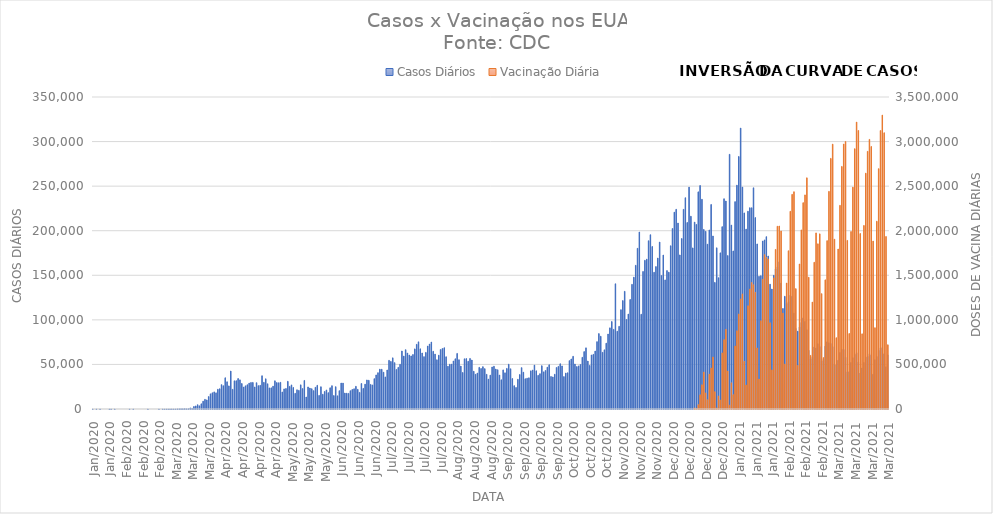
| Category | Casos Diários |
|---|---|
| Jan/2020 | 1 |
| Jan/2020 | 0 |
| Jan/2020 | 1 |
| Jan/2020 | 0 |
| Jan/2020 | 3 |
| Jan/2020 | 0 |
| Jan/2020 | 0 |
| Jan/2020 | 0 |
| Jan/2020 | 0 |
| Jan/2020 | 2 |
| Feb/2020 | 1 |
| Feb/2020 | 0 |
| Feb/2020 | 3 |
| Feb/2020 | 0 |
| Feb/2020 | 0 |
| Feb/2020 | 0 |
| Feb/2020 | 0 |
| Feb/2020 | 0 |
| Feb/2020 | 0 |
| Feb/2020 | 0 |
| Feb/2020 | 1 |
| Feb/2020 | 0 |
| Feb/2020 | 1 |
| Feb/2020 | 0 |
| Feb/2020 | 0 |
| Feb/2020 | 0 |
| Feb/2020 | 0 |
| Feb/2020 | 0 |
| Feb/2020 | 0 |
| Feb/2020 | 0 |
| Feb/2020 | 2 |
| Feb/2020 | 0 |
| Feb/2020 | 0 |
| Feb/2020 | 0 |
| Feb/2020 | 0 |
| Feb/2020 | 0 |
| Feb/2020 | 1 |
| Feb/2020 | 0 |
| Feb/2020 | 10 |
| Mar/2020 | 6 |
| Mar/2020 | 25 |
| Mar/2020 | 24 |
| Mar/2020 | 22 |
| Mar/2020 | 63 |
| Mar/2020 | 52 |
| Mar/2020 | 64 |
| Mar/2020 | 150 |
| Mar/2020 | 218 |
| Mar/2020 | 303 |
| Mar/2020 | 289 |
| Mar/2020 | 431 |
| Mar/2020 | 302 |
| Mar/2020 | 373 |
| Mar/2020 | 1203 |
| Mar/2020 | 770 |
| Mar/2020 | 2802 |
| Mar/2020 | 3425 |
| Mar/2020 | 4788 |
| Mar/2020 | 3558 |
| Mar/2020 | 5834 |
| Mar/2020 | 8831 |
| Mar/2020 | 10842 |
| Mar/2020 | 10190 |
| Mar/2020 | 13943 |
| Mar/2020 | 16972 |
| Mar/2020 | 18161 |
| Mar/2020 | 19208 |
| Mar/2020 | 18132 |
| Mar/2020 | 22132 |
| Mar/2020 | 22728 |
| Apr/2020 | 27325 |
| Apr/2020 | 26081 |
| Apr/2020 | 35038 |
| Apr/2020 | 30561 |
| Apr/2020 | 25941 |
| Apr/2020 | 42568 |
| Apr/2020 | 22060 |
| Apr/2020 | 31610 |
| Apr/2020 | 31720 |
| Apr/2020 | 34184 |
| Apr/2020 | 32682 |
| Apr/2020 | 28584 |
| Apr/2020 | 24674 |
| Apr/2020 | 25971 |
| Apr/2020 | 27207 |
| Apr/2020 | 29056 |
| Apr/2020 | 29776 |
| Apr/2020 | 29847 |
| Apr/2020 | 24696 |
| Apr/2020 | 29489 |
| Apr/2020 | 26211 |
| Apr/2020 | 26564 |
| Apr/2020 | 37308 |
| Apr/2020 | 29929 |
| Apr/2020 | 33869 |
| Apr/2020 | 28276 |
| Apr/2020 | 23680 |
| Apr/2020 | 23731 |
| Apr/2020 | 25655 |
| Apr/2020 | 31643 |
| May/2020 | 29637 |
| May/2020 | 29447 |
| May/2020 | 29955 |
| May/2020 | 19094 |
| May/2020 | 22536 |
| May/2020 | 23051 |
| May/2020 | 31058 |
| May/2020 | 25349 |
| May/2020 | 27026 |
| May/2020 | 24148 |
| May/2020 | 17595 |
| May/2020 | 21564 |
| May/2020 | 20894 |
| May/2020 | 27071 |
| May/2020 | 22894 |
| May/2020 | 32030 |
| May/2020 | 13451 |
| May/2020 | 24746 |
| May/2020 | 23546 |
| May/2020 | 22739 |
| May/2020 | 20592 |
| May/2020 | 24330 |
| May/2020 | 26547 |
| May/2020 | 15277 |
| May/2020 | 24975 |
| May/2020 | 16545 |
| May/2020 | 19713 |
| May/2020 | 21364 |
| May/2020 | 18306 |
| May/2020 | 23797 |
| May/2020 | 26146 |
| Jun/2020 | 15067 |
| Jun/2020 | 25000 |
| Jun/2020 | 14795 |
| Jun/2020 | 20549 |
| Jun/2020 | 29130 |
| Jun/2020 | 29067 |
| Jun/2020 | 17929 |
| Jun/2020 | 17711 |
| Jun/2020 | 17516 |
| Jun/2020 | 20512 |
| Jun/2020 | 21875 |
| Jun/2020 | 22693 |
| Jun/2020 | 25466 |
| Jun/2020 | 22052 |
| Jun/2020 | 18643 |
| Jun/2020 | 28581 |
| Jun/2020 | 23136 |
| Jun/2020 | 27872 |
| Jun/2020 | 32573 |
| Jun/2020 | 32250 |
| Jun/2020 | 27563 |
| Jun/2020 | 26992 |
| Jun/2020 | 34030 |
| Jun/2020 | 38200 |
| Jun/2020 | 40745 |
| Jun/2020 | 44670 |
| Jun/2020 | 44604 |
| Jun/2020 | 41267 |
| Jun/2020 | 35960 |
| Jun/2020 | 43756 |
| Jul/2020 | 54610 |
| Jul/2020 | 53393 |
| Jul/2020 | 57373 |
| Jul/2020 | 51984 |
| Jul/2020 | 44359 |
| Jul/2020 | 46716 |
| Jul/2020 | 50188 |
| Jul/2020 | 65068 |
| Jul/2020 | 59336 |
| Jul/2020 | 66527 |
| Jul/2020 | 62771 |
| Jul/2020 | 60548 |
| Jul/2020 | 59521 |
| Jul/2020 | 61154 |
| Jul/2020 | 67435 |
| Jul/2020 | 72533 |
| Jul/2020 | 75319 |
| Jul/2020 | 67495 |
| Jul/2020 | 62833 |
| Jul/2020 | 58728 |
| Jul/2020 | 63509 |
| Jul/2020 | 70635 |
| Jul/2020 | 72841 |
| Jul/2020 | 75100 |
| Jul/2020 | 64750 |
| Jul/2020 | 61596 |
| Jul/2020 | 55213 |
| Jul/2020 | 60338 |
| Jul/2020 | 66761 |
| Jul/2020 | 67842 |
| Jul/2020 | 68718 |
| Aug/2020 | 58627 |
| Aug/2020 | 48024 |
| Aug/2020 | 50166 |
| Aug/2020 | 50351 |
| Aug/2020 | 53863 |
| Aug/2020 | 56321 |
| Aug/2020 | 62358 |
| Aug/2020 | 55272 |
| Aug/2020 | 48135 |
| Aug/2020 | 40952 |
| Aug/2020 | 56321 |
| Aug/2020 | 56546 |
| Aug/2020 | 53596 |
| Aug/2020 | 56705 |
| Aug/2020 | 54945 |
| Aug/2020 | 42360 |
| Aug/2020 | 38978 |
| Aug/2020 | 40316 |
| Aug/2020 | 46730 |
| Aug/2020 | 45447 |
| Aug/2020 | 47479 |
| Aug/2020 | 45263 |
| Aug/2020 | 38896 |
| Aug/2020 | 33517 |
| Aug/2020 | 37971 |
| Aug/2020 | 47150 |
| Aug/2020 | 47976 |
| Aug/2020 | 44818 |
| Aug/2020 | 43996 |
| Aug/2020 | 38089 |
| Aug/2020 | 32750 |
| Sep/2020 | 43869 |
| Sep/2020 | 40584 |
| Sep/2020 | 45529 |
| Sep/2020 | 50266 |
| Sep/2020 | 45108 |
| Sep/2020 | 34162 |
| Sep/2020 | 26171 |
| Sep/2020 | 24174 |
| Sep/2020 | 33322 |
| Sep/2020 | 38615 |
| Sep/2020 | 46414 |
| Sep/2020 | 41309 |
| Sep/2020 | 33918 |
| Sep/2020 | 34516 |
| Sep/2020 | 35009 |
| Sep/2020 | 42785 |
| Sep/2020 | 43711 |
| Sep/2020 | 49238 |
| Sep/2020 | 42856 |
| Sep/2020 | 37738 |
| Sep/2020 | 39601 |
| Sep/2020 | 48562 |
| Sep/2020 | 41648 |
| Sep/2020 | 43241 |
| Sep/2020 | 46882 |
| Sep/2020 | 49636 |
| Sep/2020 | 36486 |
| Sep/2020 | 35947 |
| Sep/2020 | 38997 |
| Sep/2020 | 46567 |
| Oct/2020 | 47788 |
| Oct/2020 | 50742 |
| Oct/2020 | 48309 |
| Oct/2020 | 36335 |
| Oct/2020 | 40262 |
| Oct/2020 | 40665 |
| Oct/2020 | 54243 |
| Oct/2020 | 56121 |
| Oct/2020 | 59115 |
| Oct/2020 | 50434 |
| Oct/2020 | 47542 |
| Oct/2020 | 48359 |
| Oct/2020 | 49921 |
| Oct/2020 | 57989 |
| Oct/2020 | 64380 |
| Oct/2020 | 68597 |
| Oct/2020 | 53810 |
| Oct/2020 | 48887 |
| Oct/2020 | 60606 |
| Oct/2020 | 61308 |
| Oct/2020 | 64999 |
| Oct/2020 | 75551 |
| Oct/2020 | 84581 |
| Oct/2020 | 81598 |
| Oct/2020 | 63579 |
| Oct/2020 | 66364 |
| Oct/2020 | 73858 |
| Oct/2020 | 84123 |
| Oct/2020 | 91019 |
| Oct/2020 | 98074 |
| Oct/2020 | 89321 |
| Nov/2020 | 140455 |
| Nov/2020 | 87289 |
| Nov/2020 | 92774 |
| Nov/2020 | 111400 |
| Nov/2020 | 121602 |
| Nov/2020 | 132006 |
| Nov/2020 | 100402 |
| Nov/2020 | 106512 |
| Nov/2020 | 122834 |
| Nov/2020 | 139846 |
| Nov/2020 | 147871 |
| Nov/2020 | 161206 |
| Nov/2020 | 180290 |
| Nov/2020 | 198537 |
| Nov/2020 | 106285 |
| Nov/2020 | 154302 |
| Nov/2020 | 166822 |
| Nov/2020 | 168090 |
| Nov/2020 | 188745 |
| Nov/2020 | 195496 |
| Nov/2020 | 182314 |
| Nov/2020 | 153408 |
| Nov/2020 | 159737 |
| Nov/2020 | 169337 |
| Nov/2020 | 187251 |
| Nov/2020 | 149688 |
| Nov/2020 | 172695 |
| Nov/2020 | 144808 |
| Nov/2020 | 155278 |
| Nov/2020 | 153493 |
| Dec/2020 | 183105 |
| Dec/2020 | 202465 |
| Dec/2020 | 220806 |
| Dec/2020 | 224024 |
| Dec/2020 | 208609 |
| Dec/2020 | 172822 |
| Dec/2020 | 191194 |
| Dec/2020 | 223972 |
| Dec/2020 | 236998 |
| Dec/2020 | 209251 |
| Dec/2020 | 248910 |
| Dec/2020 | 216278 |
| Dec/2020 | 180704 |
| Dec/2020 | 209636 |
| Dec/2020 | 207010 |
| Dec/2020 | 243596 |
| Dec/2020 | 250704 |
| Dec/2020 | 235302 |
| Dec/2020 | 201398 |
| Dec/2020 | 199294 |
| Dec/2020 | 184903 |
| Dec/2020 | 200835 |
| Dec/2020 | 229438 |
| Dec/2020 | 194102 |
| Dec/2020 | 142031 |
| Dec/2020 | 180791 |
| Dec/2020 | 147285 |
| Dec/2020 | 175146 |
| Dec/2020 | 204522 |
| Dec/2020 | 235872 |
| Dec/2020 | 233300 |
| Jan/2021 | 172065 |
| Jan/2021 | 285697 |
| Jan/2021 | 206304 |
| Jan/2021 | 177281 |
| Jan/2021 | 232629 |
| Jan/2021 | 251095 |
| Jan/2021 | 283271 |
| Jan/2021 | 315119 |
| Jan/2021 | 248951 |
| Jan/2021 | 219942 |
| Jan/2021 | 201791 |
| Jan/2021 | 221904 |
| Jan/2021 | 225754 |
| Jan/2021 | 225747 |
| Jan/2021 | 248145 |
| Jan/2021 | 214716 |
| Jan/2021 | 185154 |
| Jan/2021 | 148830 |
| Jan/2021 | 149506 |
| Jan/2021 | 188421 |
| Jan/2021 | 189657 |
| Jan/2021 | 193321 |
| Jan/2021 | 171629 |
| Jan/2021 | 140048 |
| Jan/2021 | 134538 |
| Jan/2021 | 149982 |
| Jan/2021 | 157050 |
| Jan/2021 | 159378 |
| Jan/2021 | 165167 |
| Jan/2021 | 141232 |
| Jan/2021 | 112724 |
| Feb/2021 | 126432 |
| Feb/2021 | 118483 |
| Feb/2021 | 120286 |
| Feb/2021 | 127697 |
| Feb/2021 | 126481 |
| Feb/2021 | 107577 |
| Feb/2021 | 90423 |
| Feb/2021 | 87261 |
| Feb/2021 | 91872 |
| Feb/2021 | 97121 |
| Feb/2021 | 102234 |
| Feb/2021 | 98127 |
| Feb/2021 | 88900 |
| Feb/2021 | 65890 |
| Feb/2021 | 56073 |
| Feb/2021 | 58095 |
| Feb/2021 | 69632 |
| Feb/2021 | 68381 |
| Feb/2021 | 73197 |
| Feb/2021 | 69997 |
| Feb/2021 | 53812 |
| Feb/2021 | 55686 |
| Feb/2021 | 70565 |
| Feb/2021 | 75397 |
| Feb/2021 | 74283 |
| Feb/2021 | 73507 |
| Feb/2021 | 69932 |
| Feb/2021 | 50171 |
| Mar/2021 | 49365 |
| Mar/2021 | 54692 |
| Mar/2021 | 63297 |
| Mar/2021 | 67057 |
| Mar/2021 | 66875 |
| Mar/2021 | 57972 |
| Mar/2021 | 41682 |
| Mar/2021 | 41848 |
| Mar/2021 | 52131 |
| Mar/2021 | 57571 |
| Mar/2021 | 61349 |
| Mar/2021 | 63133 |
| Mar/2021 | 52729 |
| Mar/2021 | 40369 |
| Mar/2021 | 46027 |
| Mar/2021 | 52177 |
| Mar/2021 | 58246 |
| Mar/2021 | 59062 |
| Mar/2021 | 61893 |
| Mar/2021 | 60437 |
| Mar/2021 | 39018 |
| Mar/2021 | 55239 |
| Mar/2021 | 58922 |
| Mar/2021 | 65779 |
| Mar/2021 | 68470 |
| Mar/2021 | 68990 |
| Mar/2021 | 61994 |
| Mar/2021 | 47334 |
| Mar/2021 | 60699 |